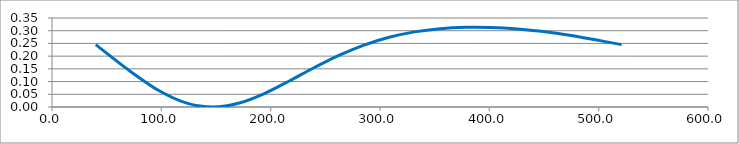
| Category | Series 0 |
|---|---|
| 40.0049 | 0.245 |
| 70.0341 | 0.145 |
| 97.6131 | 0.065 |
| 123.333 | 0.015 |
| 147.722 | 0 |
| 171.233 | 0.016 |
| 194.226 | 0.053 |
| 216.973 | 0.102 |
| 239.664 | 0.154 |
| 262.421 | 0.203 |
| 285.312 | 0.243 |
| 308.367 | 0.274 |
| 331.59 | 0.296 |
| 354.966 | 0.308 |
| 378.474 | 0.313 |
| 402.088 | 0.312 |
| 425.782 | 0.307 |
| 449.536 | 0.297 |
| 473.33 | 0.282 |
| 497.153 | 0.264 |
| 520.997 | 0.245 |